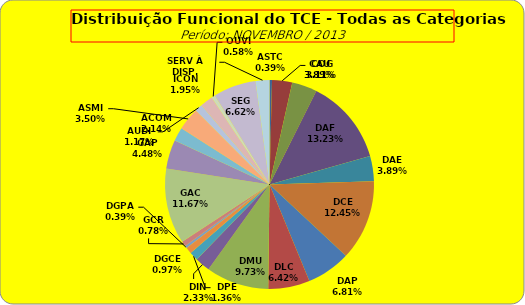
| Category | ASTC COG CAU DAF DAE DCE DAP DLC DMU DIN DPE DGCE DGPA GCR GAC GAP ACOM ASMI AUDI ICON OUVI SEG SERV À DISP. |
|---|---|
| ASTC | 2 |
| COG | 16 |
| CAU | 20 |
| DAF | 68 |
| DAE | 20 |
| DCE | 64 |
| DAP | 35 |
| DLC | 33 |
| DMU | 50 |
| DIN | 12 |
| DPE | 7 |
| DGCE | 5 |
| DGPA | 2 |
| GCR | 4 |
| GAC | 60 |
| GAP | 23 |
| ACOM | 11 |
| ASMI | 18 |
| AUDI | 6 |
| ICON | 10 |
| OUVI | 3 |
| SEG | 34 |
| SERV À DISP. | 11 |